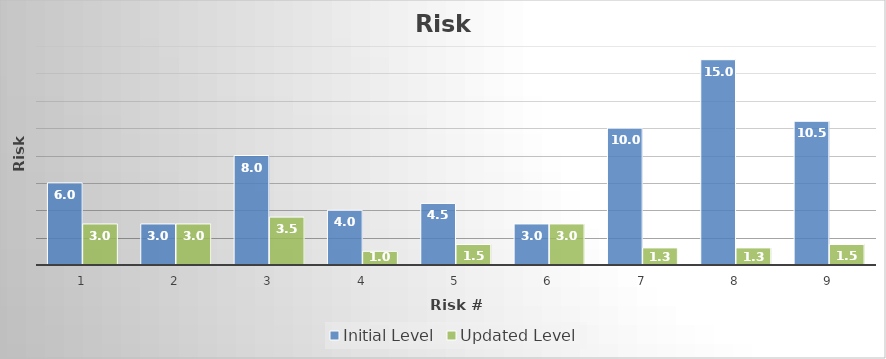
| Category | Initial Level | Updated Level |
|---|---|---|
| 0 | 6 | 3 |
| 1 | 3 | 3 |
| 2 | 8 | 3.5 |
| 3 | 4 | 1 |
| 4 | 4.5 | 1.5 |
| 5 | 3 | 3 |
| 6 | 10 | 1.25 |
| 7 | 15 | 1.25 |
| 8 | 10.5 | 1.5 |